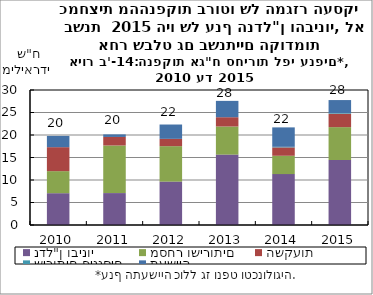
| Category | נדל"ן ובינוי | מסחר ושירותים | השקעות | שירותים פיננסים | תעשייה |
|---|---|---|---|---|---|
| 2010.0 | 7.071 | 4.896 | 5.329 | 0 | 2.504 |
| 2011.0 | 7.093 | 10.577 | 1.897 | 0 | 0.564 |
| 2012.0 | 9.64 | 7.88 | 1.622 | 0 | 3.187 |
| 2013.0 | 15.647 | 6.242 | 2.065 | 0 | 3.632 |
| 2014.0 | 11.312 | 4.074 | 1.862 | 0.124 | 4.321 |
| 2015.0 | 14.449 | 7.299 | 2.975 | 0.145 | 2.897 |